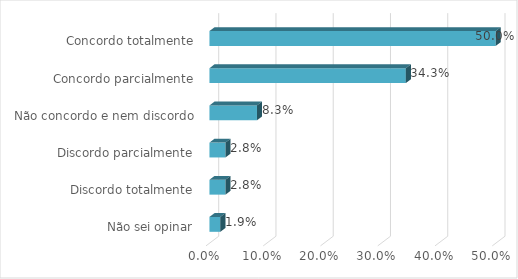
| Category | Series 0 |
|---|---|
| Não sei opinar | 0.019 |
| Discordo totalmente | 0.028 |
| Discordo parcialmente | 0.028 |
| Não concordo e nem discordo | 0.083 |
| Concordo parcialmente | 0.343 |
| Concordo totalmente | 0.5 |